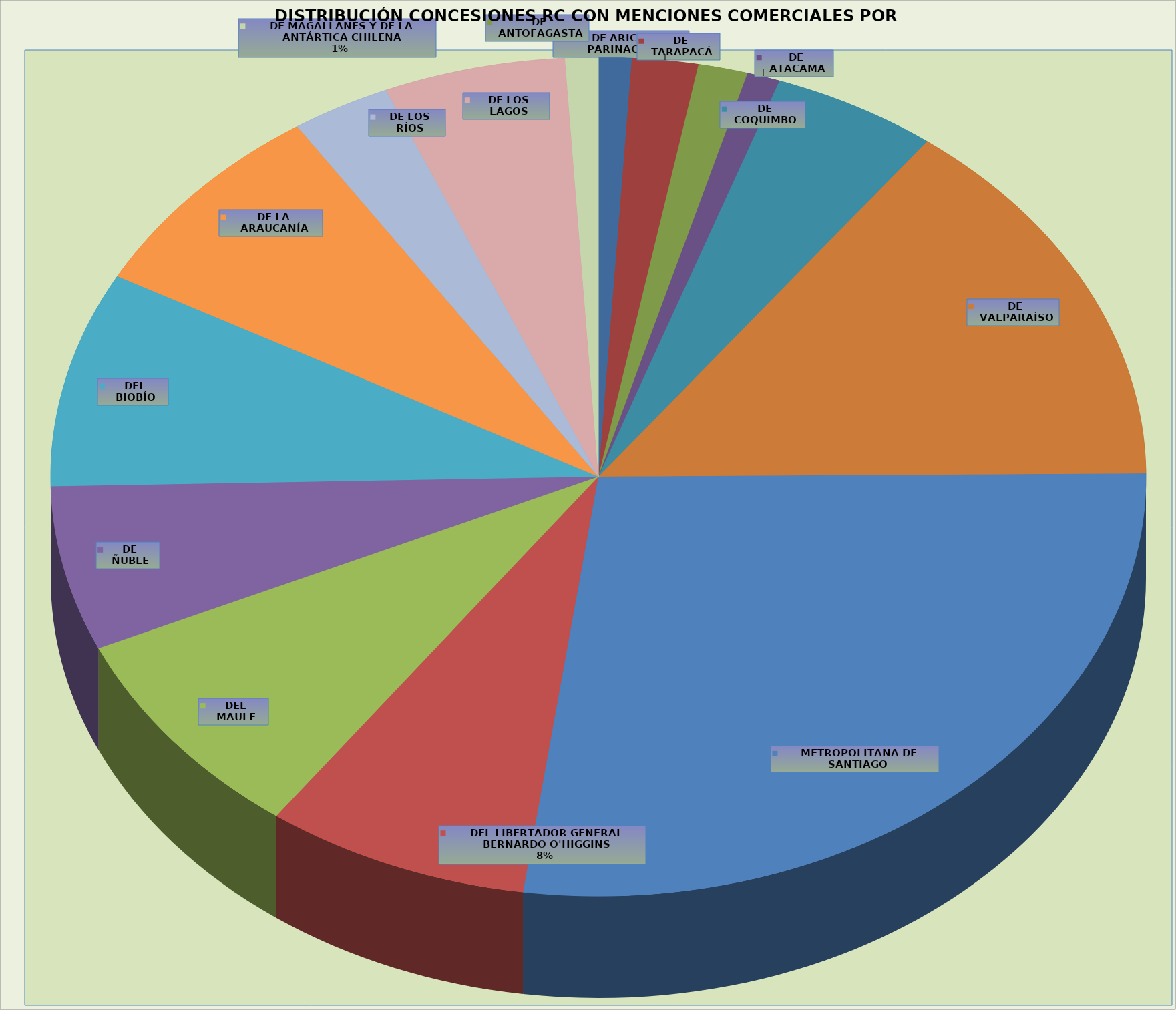
| Category | Total |
|---|---|
| DE ARICA Y PARINACOTA | 2 |
| DE TARAPACÁ | 4 |
| DE ANTOFAGASTA | 3 |
| DE ATACAMA | 2 |
| DE COQUIMBO | 10 |
| DE VALPARAÍSO | 30 |
| METROPOLITANA DE SANTIAGO | 56 |
| DEL LIBERTADOR GENERAL BERNARDO O'HIGGINS | 16 |
| DEL MAULE | 17 |
| DE ÑUBLE | 13 |
| DEL BIOBÍO | 17 |
| DE LA ARAUCANÍA | 16 |
| DE LOS RÍOS | 6 |
| DE LOS LAGOS | 11 |
| DE MAGALLANES Y DE LA ANTÁRTICA CHILENA | 2 |